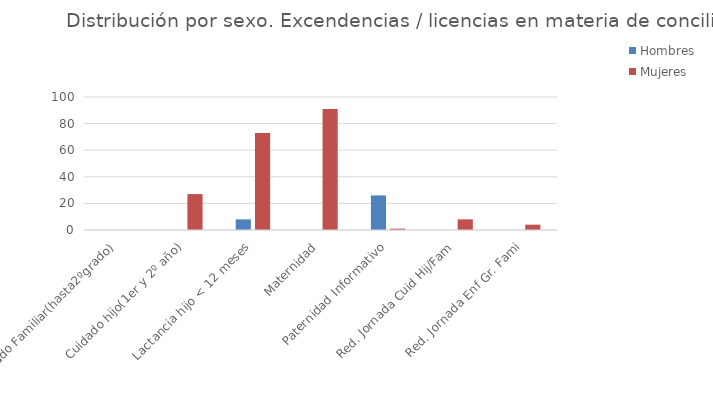
| Category | Hombres | Mujeres |
|---|---|---|
| Cuidado Familiar(hasta2ºgrado) | 0 | 0 |
| Cuidado hijo(1er y 2º año) | 0 | 27 |
| Lactancia hijo < 12 meses | 8 | 73 |
| Maternidad | 0 | 91 |
| Paternidad Informativo | 26 | 1 |
| Red. Jornada Cuid Hij/Fam | 0 | 8 |
| Red. Jornada Enf Gr. Fami | 0 | 4 |